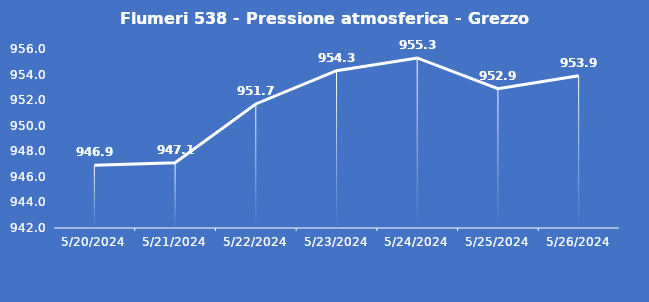
| Category | Flumeri 538 - Pressione atmosferica - Grezzo (hPa) |
|---|---|
| 5/20/24 | 946.9 |
| 5/21/24 | 947.1 |
| 5/22/24 | 951.7 |
| 5/23/24 | 954.3 |
| 5/24/24 | 955.3 |
| 5/25/24 | 952.9 |
| 5/26/24 | 953.9 |